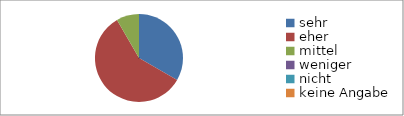
| Category | Series 0 |
|---|---|
| sehr | 8 |
| eher | 14 |
| mittel | 2 |
| weniger | 0 |
| nicht | 0 |
| keine Angabe | 0 |